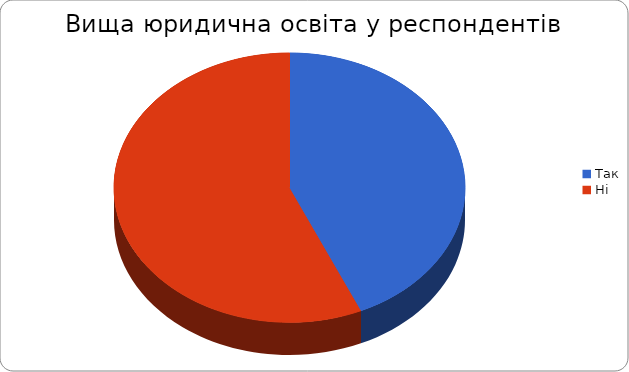
| Category | Series 0 |
|---|---|
| Так | 13 |
| Ні | 17 |